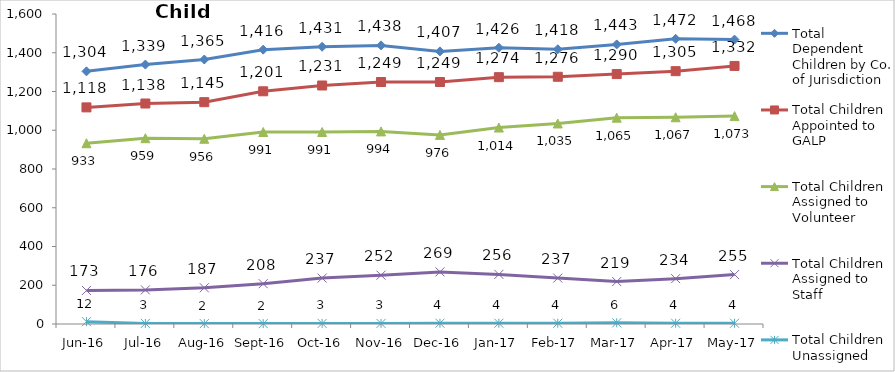
| Category | Total Dependent Children by Co. of Jurisdiction | Total Children Appointed to GALP | Total Children Assigned to Volunteer | Total Children Assigned to Staff | Total Children Unassigned |
|---|---|---|---|---|---|
| Jun-16 | 1304 | 1118 | 933 | 173 | 12 |
| Jul-16 | 1339 | 1138 | 959 | 176 | 3 |
| Aug-16 | 1365 | 1145 | 956 | 187 | 2 |
| Sep-16 | 1416 | 1201 | 991 | 208 | 2 |
| Oct-16 | 1431 | 1231 | 991 | 237 | 3 |
| Nov-16 | 1438 | 1249 | 994 | 252 | 3 |
| Dec-16 | 1407 | 1249 | 976 | 269 | 4 |
| Jan-17 | 1426 | 1274 | 1014 | 256 | 4 |
| Feb-17 | 1418 | 1276 | 1035 | 237 | 4 |
| Mar-17 | 1443 | 1290 | 1065 | 219 | 6 |
| Apr-17 | 1472 | 1305 | 1067 | 234 | 4 |
| May-17 | 1468 | 1332 | 1073 | 255 | 4 |